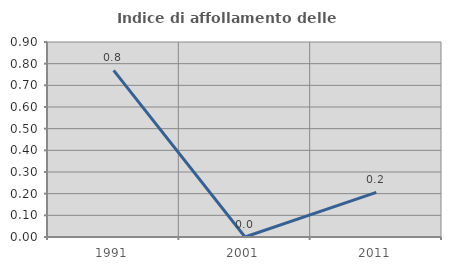
| Category | Indice di affollamento delle abitazioni  |
|---|---|
| 1991.0 | 0.769 |
| 2001.0 | 0 |
| 2011.0 | 0.206 |